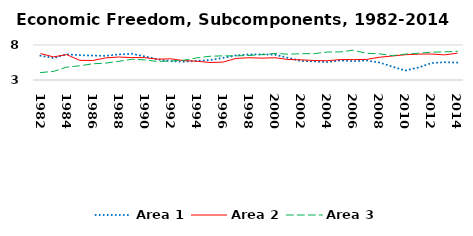
| Category | Area 1 | Area 2 | Area 3 |
|---|---|---|---|
| 1982.0 | 6.476 | 6.777 | 4.061 |
| 1983.0 | 6.139 | 6.3 | 4.227 |
| 1984.0 | 6.672 | 6.631 | 4.835 |
| 1985.0 | 6.552 | 5.813 | 5.027 |
| 1986.0 | 6.489 | 5.783 | 5.309 |
| 1987.0 | 6.448 | 6.156 | 5.415 |
| 1988.0 | 6.66 | 6.282 | 5.659 |
| 1989.0 | 6.747 | 6.204 | 5.961 |
| 1990.0 | 6.371 | 6.194 | 5.872 |
| 1991.0 | 5.945 | 5.977 | 5.647 |
| 1992.0 | 5.672 | 6.025 | 5.711 |
| 1993.0 | 5.62 | 5.761 | 5.829 |
| 1994.0 | 5.737 | 5.683 | 6.161 |
| 1995.0 | 5.843 | 5.5 | 6.391 |
| 1996.0 | 6.149 | 5.559 | 6.455 |
| 1997.0 | 6.51 | 6.082 | 6.445 |
| 1998.0 | 6.648 | 6.179 | 6.498 |
| 1999.0 | 6.665 | 6.122 | 6.633 |
| 2000.0 | 6.603 | 6.18 | 6.799 |
| 2001.0 | 6.162 | 5.931 | 6.686 |
| 2002.0 | 5.721 | 5.878 | 6.754 |
| 2003.0 | 5.64 | 5.787 | 6.765 |
| 2004.0 | 5.559 | 5.747 | 6.999 |
| 2005.0 | 5.793 | 5.919 | 7.012 |
| 2006.0 | 5.684 | 5.913 | 7.251 |
| 2007.0 | 5.793 | 5.937 | 6.815 |
| 2008.0 | 5.507 | 6.25 | 6.745 |
| 2009.0 | 4.908 | 6.427 | 6.483 |
| 2010.0 | 4.352 | 6.614 | 6.702 |
| 2011.0 | 4.781 | 6.695 | 6.827 |
| 2012.0 | 5.415 | 6.708 | 6.969 |
| 2013.0 | 5.54 | 6.588 | 7.017 |
| 2014.0 | 5.482 | 6.833 | 7.099 |